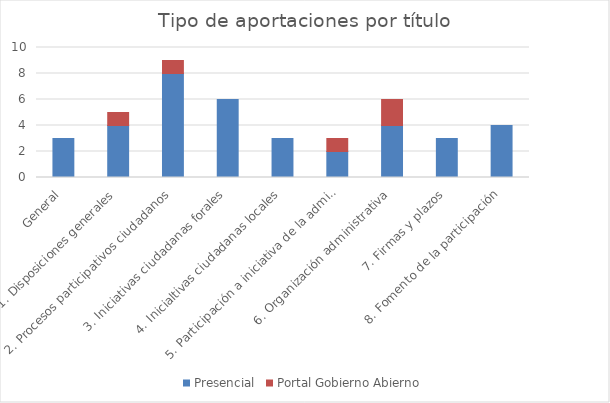
| Category | Presencial | Portal Gobierno Abierno |
|---|---|---|
| General | 3 | 0 |
| 1. Disposiciones generales | 4 | 1 |
| 2. Procesos participativos ciudadanos | 8 | 1 |
| 3. Iniciativas ciudadanas forales | 6 | 0 |
| 4. Inicialtivas ciudadanas locales | 3 | 0 |
| 5. Participación a iniciativa de la administración foral | 2 | 1 |
| 6. Organización administrativa | 4 | 2 |
| 7. Firmas y plazos | 3 | 0 |
| 8. Fomento de la participación | 4 | 0 |